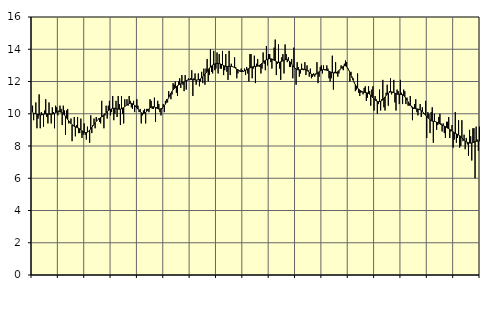
| Category | Piggar | Series 1 |
|---|---|---|
| nan | 10.5 | 10.11 |
| 87.0 | 9.6 | 10.02 |
| 87.0 | 10 | 10.02 |
| 87.0 | 10.7 | 9.99 |
| 87.0 | 9.1 | 9.97 |
| 87.0 | 9.7 | 9.95 |
| 87.0 | 11.2 | 9.93 |
| 87.0 | 9.1 | 9.93 |
| 87.0 | 10.1 | 9.93 |
| 87.0 | 10 | 9.95 |
| 87.0 | 9.2 | 9.96 |
| 87.0 | 10.2 | 9.98 |
| nan | 10.9 | 9.99 |
| 88.0 | 9.8 | 9.99 |
| 88.0 | 9.4 | 9.99 |
| 88.0 | 10.7 | 9.98 |
| 88.0 | 10 | 9.97 |
| 88.0 | 9.4 | 9.98 |
| 88.0 | 10.4 | 9.98 |
| 88.0 | 10.1 | 10 |
| 88.0 | 9.1 | 10.03 |
| 88.0 | 10.5 | 10.07 |
| 88.0 | 10.4 | 10.1 |
| 88.0 | 9.9 | 10.12 |
| nan | 10.2 | 10.13 |
| 89.0 | 10.5 | 10.12 |
| 89.0 | 10.3 | 10.1 |
| 89.0 | 9.3 | 10.06 |
| 89.0 | 10.5 | 10 |
| 89.0 | 10.2 | 9.92 |
| 89.0 | 8.7 | 9.84 |
| 89.0 | 10.2 | 9.74 |
| 89.0 | 10.3 | 9.65 |
| 89.0 | 9.4 | 9.55 |
| 89.0 | 9.5 | 9.47 |
| 89.0 | 9.7 | 9.39 |
| nan | 8.3 | 9.32 |
| 90.0 | 9.3 | 9.27 |
| 90.0 | 9.8 | 9.22 |
| 90.0 | 8.6 | 9.19 |
| 90.0 | 9.3 | 9.16 |
| 90.0 | 9.8 | 9.13 |
| 90.0 | 8.8 | 9.1 |
| 90.0 | 8.8 | 9.06 |
| 90.0 | 9.7 | 9.01 |
| 90.0 | 8.5 | 8.95 |
| 90.0 | 8.7 | 8.9 |
| 90.0 | 9.4 | 8.85 |
| nan | 8.7 | 8.83 |
| 91.0 | 8.4 | 8.83 |
| 91.0 | 9.2 | 8.86 |
| 91.0 | 8.9 | 8.91 |
| 91.0 | 8.2 | 8.98 |
| 91.0 | 9.9 | 9.06 |
| 91.0 | 8.8 | 9.15 |
| 91.0 | 9.3 | 9.25 |
| 91.0 | 9.7 | 9.35 |
| 91.0 | 9.1 | 9.45 |
| 91.0 | 9.8 | 9.53 |
| 91.0 | 9.6 | 9.6 |
| nan | 9.7 | 9.66 |
| 92.0 | 9.5 | 9.71 |
| 92.0 | 9.4 | 9.76 |
| 92.0 | 10.8 | 9.81 |
| 92.0 | 9.8 | 9.87 |
| 92.0 | 9.1 | 9.94 |
| 92.0 | 9.9 | 10.01 |
| 92.0 | 10.5 | 10.08 |
| 92.0 | 9.7 | 10.14 |
| 92.0 | 10.5 | 10.19 |
| 92.0 | 10.8 | 10.24 |
| 92.0 | 9.9 | 10.27 |
| nan | 10.1 | 10.3 |
| 93.0 | 11.1 | 10.33 |
| 93.0 | 9.6 | 10.34 |
| 93.0 | 10 | 10.34 |
| 93.0 | 10.8 | 10.32 |
| 93.0 | 9.8 | 10.3 |
| 93.0 | 11.1 | 10.29 |
| 93.0 | 10.6 | 10.28 |
| 93.0 | 9.3 | 10.29 |
| 93.0 | 11.1 | 10.31 |
| 93.0 | 10 | 10.35 |
| 93.0 | 9.4 | 10.39 |
| nan | 10.9 | 10.45 |
| 94.0 | 10.5 | 10.5 |
| 94.0 | 10.9 | 10.55 |
| 94.0 | 10.5 | 10.6 |
| 94.0 | 11.1 | 10.63 |
| 94.0 | 10.8 | 10.65 |
| 94.0 | 10.4 | 10.65 |
| 94.0 | 10.3 | 10.62 |
| 94.0 | 10.8 | 10.57 |
| 94.0 | 10.1 | 10.51 |
| 94.0 | 10.5 | 10.44 |
| 94.0 | 10.9 | 10.36 |
| nan | 10.5 | 10.29 |
| 95.0 | 10.1 | 10.21 |
| 95.0 | 10.3 | 10.13 |
| 95.0 | 9.4 | 10.07 |
| 95.0 | 9.9 | 10.03 |
| 95.0 | 10.2 | 10.01 |
| 95.0 | 10.3 | 10.03 |
| 95.0 | 9.4 | 10.08 |
| 95.0 | 10.3 | 10.15 |
| 95.0 | 10.3 | 10.22 |
| 95.0 | 10.1 | 10.3 |
| 95.0 | 10.9 | 10.36 |
| nan | 10.8 | 10.41 |
| 96.0 | 10.3 | 10.43 |
| 96.0 | 10.3 | 10.43 |
| 96.0 | 11 | 10.42 |
| 96.0 | 9.5 | 10.39 |
| 96.0 | 10.4 | 10.35 |
| 96.0 | 10.8 | 10.32 |
| 96.0 | 10.6 | 10.29 |
| 96.0 | 10.1 | 10.29 |
| 96.0 | 9.9 | 10.31 |
| 96.0 | 10.3 | 10.35 |
| 96.0 | 10.6 | 10.41 |
| nan | 10.1 | 10.5 |
| 97.0 | 10.8 | 10.6 |
| 97.0 | 10.9 | 10.73 |
| 97.0 | 10.7 | 10.87 |
| 97.0 | 11.4 | 11.01 |
| 97.0 | 11.1 | 11.15 |
| 97.0 | 10.9 | 11.27 |
| 97.0 | 11.2 | 11.38 |
| 97.0 | 11.9 | 11.48 |
| 97.0 | 11.8 | 11.56 |
| 97.0 | 12 | 11.63 |
| 97.0 | 11.3 | 11.69 |
| nan | 11.1 | 11.74 |
| 98.0 | 12 | 11.78 |
| 98.0 | 12.2 | 11.82 |
| 98.0 | 11.6 | 11.86 |
| 98.0 | 12.4 | 11.9 |
| 98.0 | 11.8 | 11.94 |
| 98.0 | 11.4 | 11.98 |
| 98.0 | 12.4 | 12.03 |
| 98.0 | 11.5 | 12.06 |
| 98.0 | 12.1 | 12.08 |
| 98.0 | 12.2 | 12.1 |
| 98.0 | 12.1 | 12.11 |
| nan | 12.2 | 12.12 |
| 99.0 | 12.7 | 12.12 |
| 99.0 | 11.1 | 12.12 |
| 99.0 | 12.2 | 12.11 |
| 99.0 | 12.5 | 12.1 |
| 99.0 | 11.8 | 12.09 |
| 99.0 | 12.1 | 12.09 |
| 99.0 | 12.5 | 12.11 |
| 99.0 | 11.7 | 12.13 |
| 99.0 | 12 | 12.17 |
| 99.0 | 12.6 | 12.22 |
| 99.0 | 11.9 | 12.29 |
| nan | 12.8 | 12.36 |
| 0.0 | 11.8 | 12.45 |
| 0.0 | 12.8 | 12.54 |
| 0.0 | 13.4 | 12.63 |
| 0.0 | 12 | 12.73 |
| 0.0 | 12.4 | 12.82 |
| 0.0 | 14 | 12.9 |
| 0.0 | 12.6 | 12.96 |
| 0.0 | 12.5 | 13.02 |
| 0.0 | 13.9 | 13.06 |
| 0.0 | 12.7 | 13.09 |
| 0.0 | 12.8 | 13.11 |
| nan | 13.8 | 13.12 |
| 1.0 | 12.5 | 13.12 |
| 1.0 | 13.7 | 13.11 |
| 1.0 | 12.8 | 13.09 |
| 1.0 | 12.8 | 13.06 |
| 1.0 | 13.9 | 13.03 |
| 1.0 | 12.4 | 12.99 |
| 1.0 | 12.7 | 12.96 |
| 1.0 | 13.7 | 12.94 |
| 1.0 | 12.6 | 12.93 |
| 1.0 | 12.1 | 12.93 |
| 1.0 | 13.9 | 12.94 |
| nan | 12.4 | 12.94 |
| 2.0 | 13.1 | 12.94 |
| 2.0 | 12.9 | 12.92 |
| 2.0 | 12.9 | 12.9 |
| 2.0 | 13.5 | 12.86 |
| 2.0 | 12.9 | 12.82 |
| 2.0 | 12.2 | 12.77 |
| 2.0 | 12.5 | 12.73 |
| 2.0 | 12.7 | 12.69 |
| 2.0 | 12.6 | 12.65 |
| 2.0 | 12.8 | 12.63 |
| 2.0 | 12.7 | 12.62 |
| nan | 12.6 | 12.63 |
| 3.0 | 12.8 | 12.66 |
| 3.0 | 12.4 | 12.7 |
| 3.0 | 12.9 | 12.73 |
| 3.0 | 12.5 | 12.77 |
| 3.0 | 12 | 12.8 |
| 3.0 | 13.7 | 12.84 |
| 3.0 | 13.7 | 12.87 |
| 3.0 | 12.2 | 12.9 |
| 3.0 | 12.8 | 12.92 |
| 3.0 | 13.6 | 12.93 |
| 3.0 | 11.9 | 12.94 |
| nan | 13.1 | 12.94 |
| 4.0 | 13.4 | 12.95 |
| 4.0 | 13 | 12.97 |
| 4.0 | 12.9 | 13.02 |
| 4.0 | 12.5 | 13.07 |
| 4.0 | 12.8 | 13.14 |
| 4.0 | 13.8 | 13.2 |
| 4.0 | 13.1 | 13.26 |
| 4.0 | 12.7 | 13.31 |
| 4.0 | 14.2 | 13.35 |
| 4.0 | 13 | 13.38 |
| 4.0 | 13.7 | 13.4 |
| nan | 13.7 | 13.42 |
| 5.0 | 13.2 | 13.41 |
| 5.0 | 12.8 | 13.39 |
| 5.0 | 13.4 | 13.36 |
| 5.0 | 14.1 | 13.32 |
| 5.0 | 14.6 | 13.28 |
| 5.0 | 12.4 | 13.23 |
| 5.0 | 13.1 | 13.2 |
| 5.0 | 14.3 | 13.19 |
| 5.0 | 12.8 | 13.19 |
| 5.0 | 12.1 | 13.22 |
| 5.0 | 13.5 | 13.25 |
| nan | 13.7 | 13.29 |
| 6.0 | 12.5 | 13.32 |
| 6.0 | 14.3 | 13.35 |
| 6.0 | 13.7 | 13.37 |
| 6.0 | 13.2 | 13.36 |
| 6.0 | 13.5 | 13.32 |
| 6.0 | 12.9 | 13.26 |
| 6.0 | 12.9 | 13.18 |
| 6.0 | 13.4 | 13.09 |
| 6.0 | 12.2 | 12.98 |
| 6.0 | 14.1 | 12.9 |
| 6.0 | 12.8 | 12.83 |
| nan | 11.8 | 12.77 |
| 7.0 | 13.2 | 12.74 |
| 7.0 | 12.9 | 12.72 |
| 7.0 | 12.3 | 12.72 |
| 7.0 | 12.5 | 12.72 |
| 7.0 | 13.1 | 12.74 |
| 7.0 | 12.8 | 12.75 |
| 7.0 | 12.7 | 12.76 |
| 7.0 | 13.2 | 12.76 |
| 7.0 | 12.4 | 12.73 |
| 7.0 | 13 | 12.69 |
| 7.0 | 12.7 | 12.63 |
| nan | 12.3 | 12.57 |
| 8.0 | 12.8 | 12.51 |
| 8.0 | 12.2 | 12.46 |
| 8.0 | 12.3 | 12.42 |
| 8.0 | 12.5 | 12.41 |
| 8.0 | 12.3 | 12.42 |
| 8.0 | 12.5 | 12.45 |
| 8.0 | 13.2 | 12.49 |
| 8.0 | 11.9 | 12.55 |
| 8.0 | 12.3 | 12.61 |
| 8.0 | 12.9 | 12.66 |
| 8.0 | 13 | 12.7 |
| nan | 12.5 | 12.73 |
| 9.0 | 13 | 12.75 |
| 9.0 | 12.7 | 12.74 |
| 9.0 | 12.7 | 12.73 |
| 9.0 | 13 | 12.7 |
| 9.0 | 12.8 | 12.67 |
| 9.0 | 12.2 | 12.64 |
| 9.0 | 12 | 12.6 |
| 9.0 | 12.2 | 12.57 |
| 9.0 | 13.6 | 12.55 |
| 9.0 | 11.5 | 12.54 |
| 9.0 | 12.6 | 12.53 |
| nan | 13.2 | 12.54 |
| 10.0 | 12.5 | 12.56 |
| 10.0 | 12.3 | 12.61 |
| 10.0 | 12.5 | 12.67 |
| 10.0 | 12.7 | 12.75 |
| 10.0 | 13 | 12.83 |
| 10.0 | 12.8 | 12.9 |
| 10.0 | 12.7 | 12.95 |
| 10.0 | 13.1 | 12.98 |
| 10.0 | 13.3 | 12.97 |
| 10.0 | 13.2 | 12.92 |
| 10.0 | 12.8 | 12.83 |
| nan | 12.7 | 12.71 |
| 11.0 | 12 | 12.56 |
| 11.0 | 12.6 | 12.4 |
| 11.0 | 12.3 | 12.24 |
| 11.0 | 12.2 | 12.08 |
| 11.0 | 11.9 | 11.93 |
| 11.0 | 11.4 | 11.8 |
| 11.0 | 11.5 | 11.69 |
| 11.0 | 12.5 | 11.6 |
| 11.0 | 11.3 | 11.53 |
| 11.0 | 11.1 | 11.47 |
| 11.0 | 11.3 | 11.41 |
| nan | 11.4 | 11.38 |
| 12.0 | 11.2 | 11.35 |
| 12.0 | 11.6 | 11.33 |
| 12.0 | 11.7 | 11.32 |
| 12.0 | 10.8 | 11.31 |
| 12.0 | 11 | 11.29 |
| 12.0 | 11.7 | 11.26 |
| 12.0 | 11.4 | 11.22 |
| 12.0 | 10.5 | 11.15 |
| 12.0 | 11.5 | 11.07 |
| 12.0 | 11.7 | 10.99 |
| 12.0 | 10.2 | 10.92 |
| nan | 11.1 | 10.86 |
| 13.0 | 10.9 | 10.8 |
| 13.0 | 10 | 10.77 |
| 13.0 | 10.6 | 10.75 |
| 13.0 | 11.5 | 10.75 |
| 13.0 | 10.2 | 10.77 |
| 13.0 | 10.9 | 10.81 |
| 13.0 | 12.1 | 10.87 |
| 13.0 | 10.4 | 10.95 |
| 13.0 | 10.2 | 11.04 |
| 13.0 | 11.3 | 11.13 |
| 13.0 | 11.8 | 11.21 |
| nan | 10.5 | 11.28 |
| 14.0 | 11.4 | 11.33 |
| 14.0 | 12.2 | 11.35 |
| 14.0 | 11.2 | 11.36 |
| 14.0 | 11.3 | 11.34 |
| 14.0 | 12.1 | 11.31 |
| 14.0 | 10.7 | 11.28 |
| 14.0 | 10.2 | 11.24 |
| 14.0 | 11.5 | 11.22 |
| 14.0 | 11.4 | 11.2 |
| 14.0 | 10.6 | 11.2 |
| 14.0 | 12.1 | 11.2 |
| nan | 11.3 | 11.19 |
| 15.0 | 10.6 | 11.18 |
| 15.0 | 11.5 | 11.13 |
| 15.0 | 11.4 | 11.06 |
| 15.0 | 10.6 | 10.96 |
| 15.0 | 11 | 10.85 |
| 15.0 | 10.5 | 10.74 |
| 15.0 | 10.5 | 10.63 |
| 15.0 | 11.1 | 10.54 |
| 15.0 | 10.4 | 10.47 |
| 15.0 | 9.6 | 10.41 |
| 15.0 | 10.3 | 10.36 |
| nan | 10.6 | 10.33 |
| 16.0 | 10.9 | 10.31 |
| 16.0 | 10.1 | 10.3 |
| 16.0 | 9.9 | 10.29 |
| 16.0 | 10.3 | 10.27 |
| 16.0 | 10.6 | 10.24 |
| 16.0 | 9.8 | 10.19 |
| 16.0 | 10.4 | 10.13 |
| 16.0 | 10 | 10.06 |
| 16.0 | 10 | 9.98 |
| 16.0 | 10.8 | 9.91 |
| 16.0 | 8.5 | 9.84 |
| nan | 10.1 | 9.76 |
| 17.0 | 10 | 9.69 |
| 17.0 | 8.8 | 9.63 |
| 17.0 | 10.1 | 9.58 |
| 17.0 | 10.4 | 9.54 |
| 17.0 | 8.2 | 9.53 |
| 17.0 | 10 | 9.52 |
| 17.0 | 9.5 | 9.51 |
| 17.0 | 9 | 9.48 |
| 17.0 | 9.3 | 9.45 |
| 17.0 | 9.8 | 9.41 |
| 17.0 | 10 | 9.37 |
| nan | 9.4 | 9.33 |
| 18.0 | 8.9 | 9.3 |
| 18.0 | 9.4 | 9.27 |
| 18.0 | 8.8 | 9.23 |
| 18.0 | 8.5 | 9.2 |
| 18.0 | 9.5 | 9.15 |
| 18.0 | 9.5 | 9.11 |
| 18.0 | 9.8 | 9.07 |
| 18.0 | 8.5 | 9.03 |
| 18.0 | 8.9 | 8.99 |
| 18.0 | 9.3 | 8.94 |
| 18.0 | 7.9 | 8.88 |
| nan | 8.4 | 8.83 |
| 19.0 | 10.1 | 8.78 |
| 19.0 | 8.2 | 8.75 |
| 19.0 | 8.5 | 8.72 |
| 19.0 | 9.6 | 8.68 |
| 19.0 | 7.9 | 8.64 |
| 19.0 | 8 | 8.59 |
| 19.0 | 9.6 | 8.51 |
| 19.0 | 8.3 | 8.43 |
| 19.0 | 8.7 | 8.37 |
| 19.0 | 7.8 | 8.31 |
| 19.0 | 8.5 | 8.26 |
| nan | 8.1 | 8.23 |
| 20.0 | 7.4 | 8.2 |
| 20.0 | 9 | 8.18 |
| 20.0 | 8.6 | 8.18 |
| 20.0 | 7.1 | 8.19 |
| 20.0 | 9.1 | 8.21 |
| 20.0 | 9.1 | 8.24 |
| 20.0 | 6 | 8.27 |
| 20.0 | 9.2 | 8.29 |
| 20.0 | 8.4 | 8.3 |
| 20.0 | 7.7 | 8.3 |
| 20.0 | 9.2 | 8.3 |